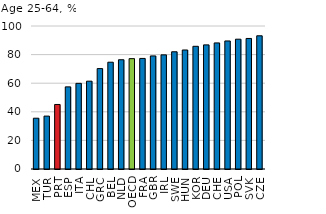
| Category | At least upper secondary education |
|---|---|
| MEX | 35.521 |
| TUR | 36.992 |
| PRT | 45.123 |
| ESP | 57.434 |
| ITA | 59.891 |
| CHL | 61.414 |
| GRC | 70.22 |
| BEL | 74.677 |
| NLD | 76.4 |
| OECD | 77.166 |
| FRA | 77.319 |
| GBR | 79.072 |
| IRL | 79.817 |
| SWE | 81.976 |
| HUN | 83.217 |
| KOR | 85.803 |
| DEU | 86.791 |
| CHE | 88.16 |
| USA | 89.542 |
| POL | 90.778 |
| SVK | 91.285 |
| CZE | 93.159 |